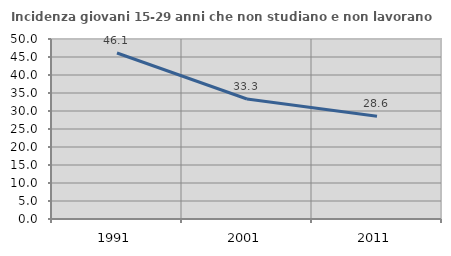
| Category | Incidenza giovani 15-29 anni che non studiano e non lavorano  |
|---|---|
| 1991.0 | 46.121 |
| 2001.0 | 33.333 |
| 2011.0 | 28.571 |